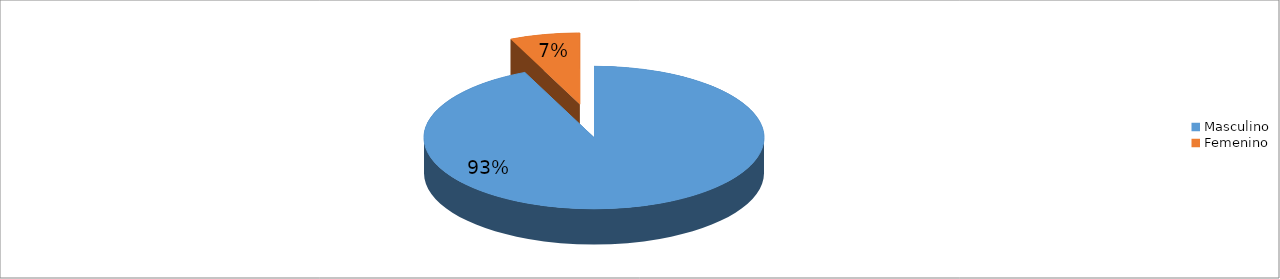
| Category | Series 0 |
|---|---|
| Masculino | 0.933 |
| Femenino | 0.067 |